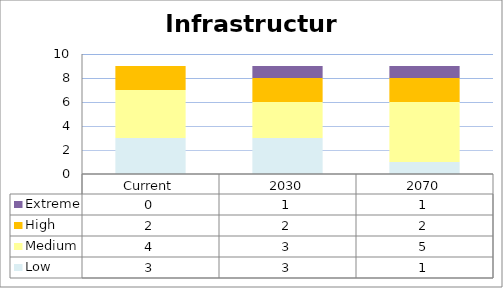
| Category | Low | Medium | High | Extreme |
|---|---|---|---|---|
| Current | 3 | 4 | 2 | 0 |
| 2030 | 3 | 3 | 2 | 1 |
| 2070 | 1 | 5 | 2 | 1 |